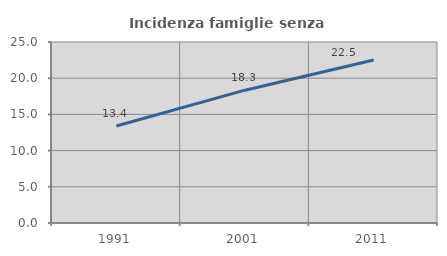
| Category | Incidenza famiglie senza nuclei |
|---|---|
| 1991.0 | 13.393 |
| 2001.0 | 18.346 |
| 2011.0 | 22.516 |